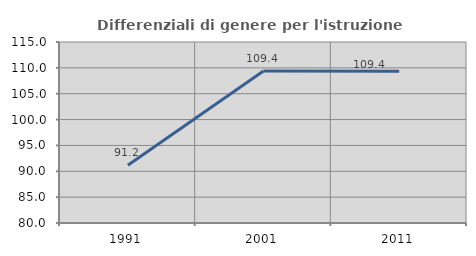
| Category | Differenziali di genere per l'istruzione superiore |
|---|---|
| 1991.0 | 91.182 |
| 2001.0 | 109.377 |
| 2011.0 | 109.352 |